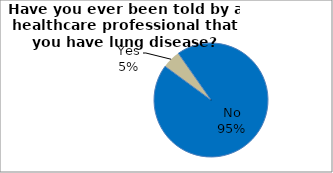
| Category | Series 0 |
|---|---|
| No | 94.793 |
| Yes | 5.207 |